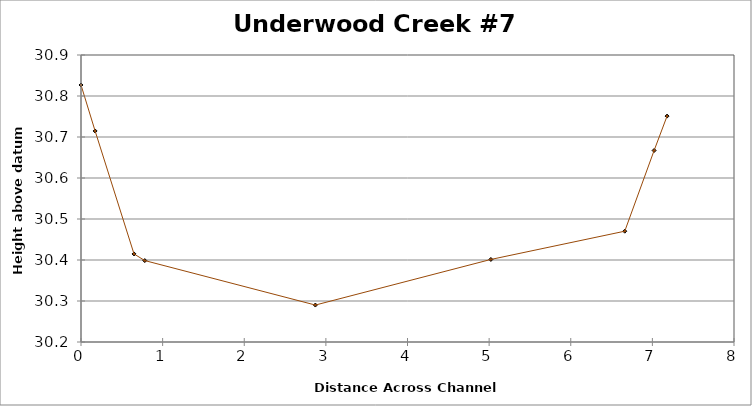
| Category | Series 0 |
|---|---|
| 0.0 | 30.827 |
| 0.17304266707506757 | 30.715 |
| 0.6495073449293872 | 30.415 |
| 0.7812038865375854 | 30.399 |
| 2.8713314625190476 | 30.29 |
| 5.021248751490296 | 30.401 |
| 6.6617262671257915 | 30.47 |
| 7.0213426983552285 | 30.667 |
| 7.1799769335717825 | 30.751 |